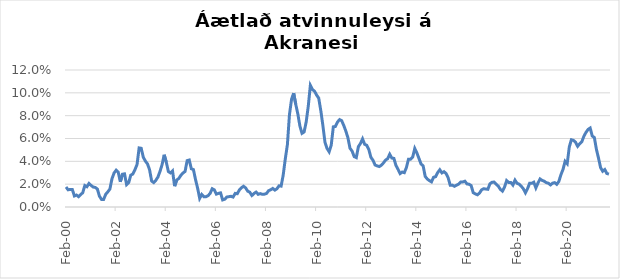
| Category | Series 0 |
|---|---|
| 2000-02-01 | 0.018 |
| 2000-03-01 | 0.015 |
| 2000-04-01 | 0.015 |
| 2000-05-01 | 0.015 |
| 2000-06-01 | 0.01 |
| 2000-07-01 | 0.01 |
| 2000-08-01 | 0.009 |
| 2000-09-01 | 0.011 |
| 2000-10-01 | 0.013 |
| 2000-11-01 | 0.019 |
| 2000-12-01 | 0.018 |
| 2001-01-01 | 0.021 |
| 2001-02-01 | 0.019 |
| 2001-03-01 | 0.017 |
| 2001-04-01 | 0.017 |
| 2001-05-01 | 0.016 |
| 2001-06-01 | 0.009 |
| 2001-07-01 | 0.007 |
| 2001-08-01 | 0.007 |
| 2001-09-01 | 0.011 |
| 2001-10-01 | 0.013 |
| 2001-11-01 | 0.016 |
| 2001-12-01 | 0.025 |
| 2002-01-01 | 0.03 |
| 2002-02-01 | 0.032 |
| 2002-03-01 | 0.03 |
| 2002-04-01 | 0.022 |
| 2002-05-01 | 0.029 |
| 2002-06-01 | 0.029 |
| 2002-07-01 | 0.02 |
| 2002-08-01 | 0.021 |
| 2002-09-01 | 0.028 |
| 2002-10-01 | 0.029 |
| 2002-11-01 | 0.033 |
| 2002-12-01 | 0.037 |
| 2003-01-01 | 0.052 |
| 2003-02-01 | 0.051 |
| 2003-03-01 | 0.044 |
| 2003-04-01 | 0.04 |
| 2003-05-01 | 0.038 |
| 2003-06-01 | 0.033 |
| 2003-07-01 | 0.023 |
| 2003-08-01 | 0.021 |
| 2003-09-01 | 0.023 |
| 2003-10-01 | 0.026 |
| 2003-11-01 | 0.031 |
| 2003-12-01 | 0.037 |
| 2004-01-01 | 0.046 |
| 2004-02-01 | 0.039 |
| 2004-03-01 | 0.031 |
| 2004-04-01 | 0.03 |
| 2004-05-01 | 0.032 |
| 2004-06-01 | 0.018 |
| 2004-07-01 | 0.024 |
| 2004-08-01 | 0.025 |
| 2004-09-01 | 0.028 |
| 2004-10-01 | 0.03 |
| 2004-11-01 | 0.031 |
| 2004-12-01 | 0.041 |
| 2005-01-01 | 0.041 |
| 2005-02-01 | 0.033 |
| 2005-03-01 | 0.033 |
| 2005-04-01 | 0.024 |
| 2005-05-01 | 0.017 |
| 2005-06-01 | 0.008 |
| 2005-07-01 | 0.011 |
| 2005-08-01 | 0.009 |
| 2005-09-01 | 0.009 |
| 2005-10-01 | 0.01 |
| 2005-11-01 | 0.012 |
| 2005-12-01 | 0.016 |
| 2006-01-01 | 0.015 |
| 2006-02-01 | 0.011 |
| 2006-03-01 | 0.012 |
| 2006-04-01 | 0.012 |
| 2006-05-01 | 0.006 |
| 2006-06-01 | 0.007 |
| 2006-07-01 | 0.009 |
| 2006-08-01 | 0.009 |
| 2006-09-01 | 0.009 |
| 2006-10-01 | 0.009 |
| 2006-11-01 | 0.012 |
| 2006-12-01 | 0.012 |
| 2007-01-01 | 0.015 |
| 2007-02-01 | 0.017 |
| 2007-03-01 | 0.018 |
| 2007-04-01 | 0.017 |
| 2007-05-01 | 0.014 |
| 2007-06-01 | 0.013 |
| 2007-07-01 | 0.01 |
| 2007-08-01 | 0.012 |
| 2007-09-01 | 0.013 |
| 2007-10-01 | 0.011 |
| 2007-11-01 | 0.012 |
| 2007-12-01 | 0.011 |
| 2008-01-01 | 0.011 |
| 2008-02-01 | 0.012 |
| 2008-03-01 | 0.014 |
| 2008-04-01 | 0.015 |
| 2008-05-01 | 0.016 |
| 2008-06-01 | 0.015 |
| 2008-07-01 | 0.016 |
| 2008-08-01 | 0.019 |
| 2008-09-01 | 0.018 |
| 2008-10-01 | 0.028 |
| 2008-11-01 | 0.042 |
| 2008-12-01 | 0.055 |
| 2009-01-01 | 0.081 |
| 2009-02-01 | 0.094 |
| 2009-03-01 | 0.1 |
| 2009-04-01 | 0.09 |
| 2009-05-01 | 0.082 |
| 2009-06-01 | 0.071 |
| 2009-07-01 | 0.065 |
| 2009-08-01 | 0.066 |
| 2009-09-01 | 0.074 |
| 2009-10-01 | 0.088 |
| 2009-11-01 | 0.106 |
| 2009-12-01 | 0.103 |
| 2010-01-01 | 0.101 |
| 2010-02-01 | 0.098 |
| 2010-03-01 | 0.095 |
| 2010-04-01 | 0.085 |
| 2010-05-01 | 0.071 |
| 2010-06-01 | 0.057 |
| 2010-07-01 | 0.051 |
| 2010-08-01 | 0.048 |
| 2010-09-01 | 0.054 |
| 2010-10-01 | 0.07 |
| 2010-11-01 | 0.071 |
| 2010-12-01 | 0.074 |
| 2011-01-01 | 0.077 |
| 2011-02-01 | 0.076 |
| 2011-03-01 | 0.071 |
| 2011-04-01 | 0.066 |
| 2011-05-01 | 0.061 |
| 2011-06-01 | 0.051 |
| 2011-07-01 | 0.049 |
| 2011-08-01 | 0.044 |
| 2011-09-01 | 0.043 |
| 2011-10-01 | 0.053 |
| 2011-11-01 | 0.056 |
| 2011-12-01 | 0.06 |
| 2012-01-01 | 0.055 |
| 2012-02-01 | 0.054 |
| 2012-03-01 | 0.05 |
| 2012-04-01 | 0.044 |
| 2012-05-01 | 0.041 |
| 2012-06-01 | 0.037 |
| 2012-07-01 | 0.036 |
| 2012-08-01 | 0.035 |
| 2012-09-01 | 0.037 |
| 2012-10-01 | 0.039 |
| 2012-11-01 | 0.041 |
| 2012-12-01 | 0.042 |
| 2013-01-01 | 0.046 |
| 2013-02-01 | 0.043 |
| 2013-03-01 | 0.043 |
| 2013-04-01 | 0.036 |
| 2013-05-01 | 0.033 |
| 2013-06-01 | 0.029 |
| 2013-07-01 | 0.031 |
| 2013-08-01 | 0.03 |
| 2013-09-01 | 0.035 |
| 2013-10-01 | 0.042 |
| 2013-11-01 | 0.042 |
| 2013-12-01 | 0.044 |
| 2014-01-01 | 0.051 |
| 2014-02-01 | 0.047 |
| 2014-03-01 | 0.043 |
| 2014-04-01 | 0.038 |
| 2014-05-01 | 0.036 |
| 2014-06-01 | 0.027 |
| 2014-07-01 | 0.024 |
| 2014-08-01 | 0.023 |
| 2014-09-01 | 0.022 |
| 2014-10-01 | 0.026 |
| 2014-11-01 | 0.027 |
| 2014-12-01 | 0.03 |
| 2015-01-01 | 0.033 |
| 2015-02-01 | 0.03 |
| 2015-03-01 | 0.031 |
| 2015-04-01 | 0.029 |
| 2015-05-01 | 0.026 |
| 2015-06-01 | 0.019 |
| 2015-07-01 | 0.019 |
| 2015-08-01 | 0.018 |
| 2015-09-01 | 0.019 |
| 2015-10-01 | 0.02 |
| 2015-11-01 | 0.022 |
| 2015-12-01 | 0.022 |
| 2016-01-01 | 0.023 |
| 2016-02-01 | 0.02 |
| 2016-03-01 | 0.02 |
| 2016-04-01 | 0.019 |
| 2016-05-01 | 0.013 |
| 2016-06-01 | 0.011 |
| 2016-07-01 | 0.011 |
| 2016-08-01 | 0.012 |
| 2016-09-01 | 0.015 |
| 2016-10-01 | 0.016 |
| 2016-11-01 | 0.016 |
| 2016-12-01 | 0.015 |
| 2017-01-01 | 0.02 |
| 2017-02-01 | 0.022 |
| 2017-03-01 | 0.022 |
| 2017-04-01 | 0.02 |
| 2017-05-01 | 0.018 |
| 2017-06-01 | 0.015 |
| 2017-07-01 | 0.014 |
| 2017-08-01 | 0.017 |
| 2017-09-01 | 0.023 |
| 2017-10-01 | 0.021 |
| 2017-11-01 | 0.021 |
| 2017-12-01 | 0.019 |
| 2018-01-01 | 0.024 |
| 2018-02-01 | 0.021 |
| 2018-03-01 | 0.02 |
| 2018-04-01 | 0.018 |
| 2018-05-01 | 0.016 |
| 2018-06-01 | 0.012 |
| 2018-07-01 | 0.016 |
| 2018-08-01 | 0.021 |
| 2018-09-01 | 0.021 |
| 2018-10-01 | 0.022 |
| 2018-11-01 | 0.017 |
| 2018-12-01 | 0.021 |
| 2019-01-01 | 0.025 |
| 2019-02-01 | 0.023 |
| 2019-03-01 | 0.023 |
| 2019-04-01 | 0.021 |
| 2019-05-01 | 0.021 |
| 2019-06-01 | 0.019 |
| 2019-07-01 | 0.021 |
| 2019-08-01 | 0.021 |
| 2019-09-01 | 0.02 |
| 2019-10-01 | 0.022 |
| 2019-11-01 | 0.028 |
| 2019-12-01 | 0.033 |
| 2020-01-01 | 0.04 |
| 2020-02-01 | 0.038 |
| 2020-03-01 | 0.053 |
| 2020-04-01 | 0.059 |
| 2020-05-01 | 0.058 |
| 2020-06-01 | 0.057 |
| 2020-07-01 | 0.053 |
| 2020-08-01 | 0.055 |
| 2020-09-01 | 0.057 |
| 2020-10-01 | 0.062 |
| 2020-11-01 | 0.065 |
| 2020-12-01 | 0.068 |
| 2021-01-01 | 0.069 |
| 2021-02-01 | 0.062 |
| 2021-03-01 | 0.061 |
| 2021-04-01 | 0.05 |
| 2021-05-01 | 0.043 |
| 2021-06-01 | 0.034 |
| 2021-07-01 | 0.031 |
| 2021-08-01 | 0.033 |
| 2021-09-01 | 0.029 |
| 2021-10-01 | 0.029 |